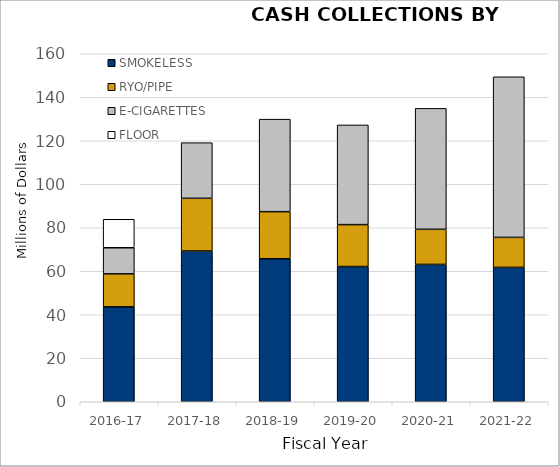
| Category | SMOKELESS | RYO/PIPE | E-CIGARETTES | FLOOR |
|---|---|---|---|---|
| 2016-17 | 43.631 | 15.171 | 12 | 13.1 |
| 2017-18 | 69.321 | 24.226 | 25.573 | 0 |
| 2018-19 | 65.756 | 21.649 | 42.525 | 0 |
| 2019-20 | 62.17 | 19.269 | 45.835 | 0 |
| 2020-21 | 63.146 | 16.147 | 55.601 | 0 |
| 2021-22 | 61.793 | 13.781 | 73.842 | 0 |